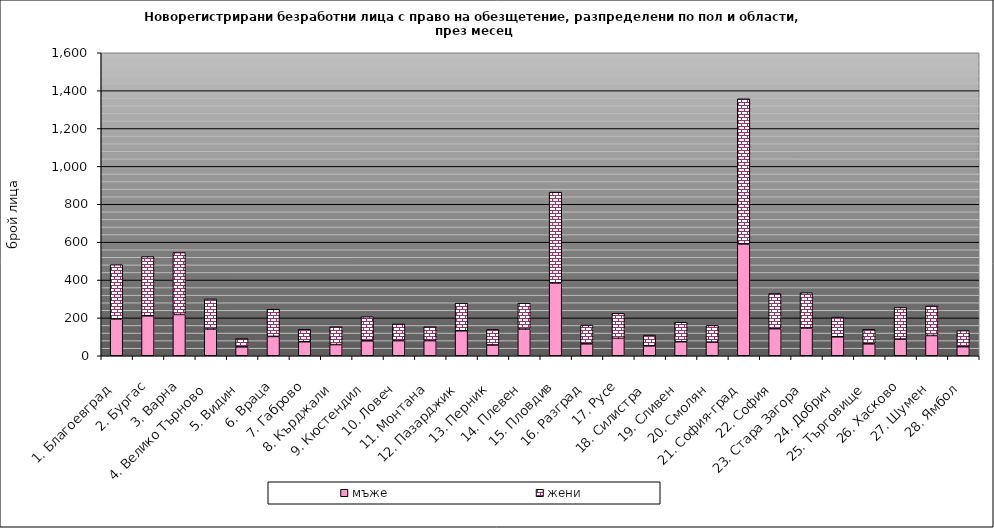
| Category | мъже | жени |
|---|---|---|
| 1. Благоевград | 194 | 287 |
| 2. Бургас | 211 | 313 |
| 3. Варна | 218 | 327 |
| 4. Велико Търново | 141 | 159 |
| 5. Видин | 47 | 44 |
| 6. Враца | 102 | 144 |
| 7. Габрово | 74 | 66 |
| 8. Кърджали | 59 | 94 |
| 9. Кюстендил | 79 | 127 |
| 10. Ловеч | 80 | 88 |
| 11. Монтана | 80 | 73 |
| 12. Пазарджик | 132 | 146 |
| 13. Перник | 57 | 82 |
| 14. Плевен | 141 | 137 |
| 15. Пловдив | 384 | 480 |
| 16. Разград | 63 | 99 |
| 17. Русе | 92 | 132 |
| 18. Силистра | 52 | 57 |
| 19. Сливен | 74 | 103 |
| 20. Смолян | 72 | 88 |
| 21. София-град | 590 | 767 |
| 22. София | 143 | 186 |
| 23. Стара Загора | 146 | 187 |
| 24. Добрич | 100 | 104 |
| 25. Търговище | 63 | 77 |
| 26. Хасково | 88 | 167 |
| 27. Шумен | 107 | 156 |
| 28. Ямбол | 48 | 85 |